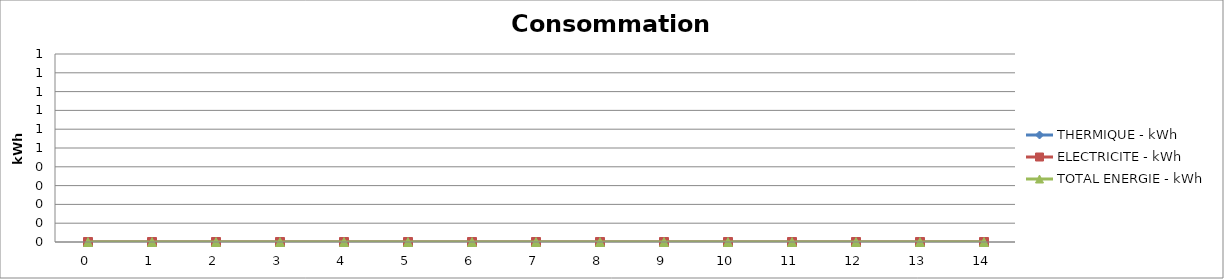
| Category | THERMIQUE - kWh | ELECTRICITE - kWh | TOTAL ENERGIE - kWh |
|---|---|---|---|
| 0.0 | 0 | 0 | 0 |
| 1.0 | 0 | 0 | 0 |
| 2.0 | 0 | 0 | 0 |
| 3.0 | 0 | 0 | 0 |
| 4.0 | 0 | 0 | 0 |
| 5.0 | 0 | 0 | 0 |
| 6.0 | 0 | 0 | 0 |
| 7.0 | 0 | 0 | 0 |
| 8.0 | 0 | 0 | 0 |
| 9.0 | 0 | 0 | 0 |
| 10.0 | 0 | 0 | 0 |
| 11.0 | 0 | 0 | 0 |
| 12.0 | 0 | 0 | 0 |
| 13.0 | 0 | 0 | 0 |
| 14.0 | 0 | 0 | 0 |